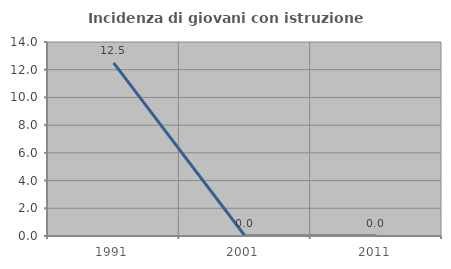
| Category | Incidenza di giovani con istruzione universitaria |
|---|---|
| 1991.0 | 12.5 |
| 2001.0 | 0 |
| 2011.0 | 0 |